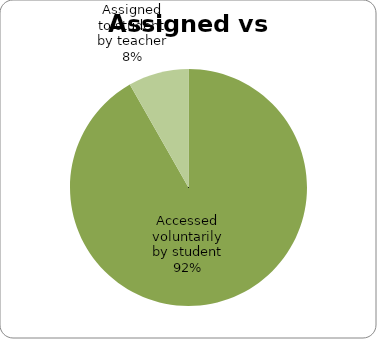
| Category | Series 0 |
|---|---|
| Accessed voluntarily by student | 8288 |
| Assigned to student by teacher | 745 |